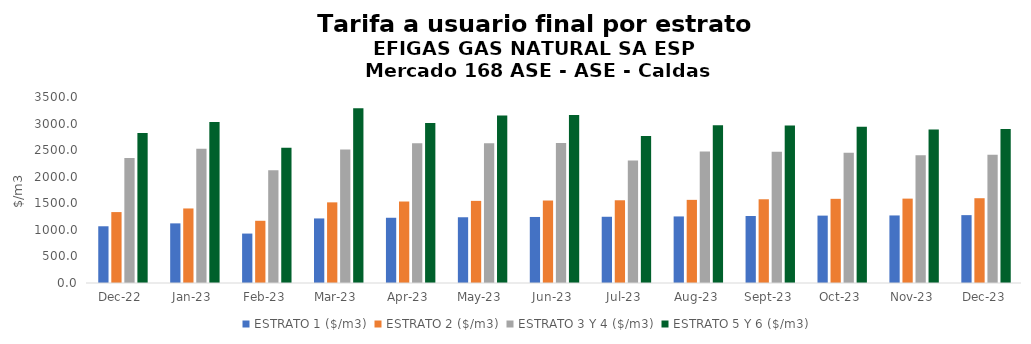
| Category | ESTRATO 1 ($/m3) | ESTRATO 2 ($/m3) | ESTRATO 3 Y 4 ($/m3) | ESTRATO 5 Y 6 ($/m3) |
|---|---|---|---|---|
| 2022-12-01 | 1067.55 | 1334.45 | 2351.81 | 2822.172 |
| 2023-01-01 | 1122.06 | 1402.59 | 2525 | 3030 |
| 2023-02-01 | 930.14 | 1170.78 | 2119.87 | 2543.844 |
| 2023-03-01 | 1214.8 | 1517.42 | 2509.997 | 3287.928 |
| 2023-04-01 | 1227.57 | 1533.36 | 2628.313 | 3011.997 |
| 2023-05-01 | 1237.16 | 1545.35 | 2628.313 | 3153.975 |
| 2023-06-01 | 1242.57 | 1552.1 | 2634.476 | 3161.371 |
| 2023-07-01 | 1246.29 | 1556.75 | 2305.861 | 2767.033 |
| 2023-08-01 | 1252.53 | 1564.55 | 2473.749 | 2968.499 |
| 2023-09-01 | 1261.29 | 1575.49 | 2470.388 | 2964.465 |
| 2023-10-01 | 1268 | 1583.87 | 2451.642 | 2941.971 |
| 2023-11-01 | 1271.17 | 1587.82 | 2405.876 | 2887.051 |
| 2023-12-01 | 1277.13 | 1595.27 | 2413.103 | 2895.724 |